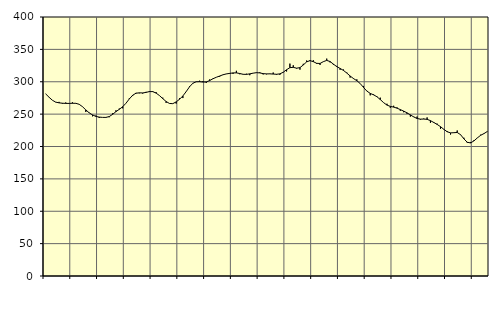
| Category | Piggar | Series 1 |
|---|---|---|
| nan | 281 | 281.24 |
| 87.0 | 276.2 | 276.09 |
| 87.0 | 271.5 | 271.44 |
| 87.0 | 268.3 | 268.53 |
| nan | 268.9 | 267.4 |
| 88.0 | 266.1 | 266.85 |
| 88.0 | 268 | 266.55 |
| 88.0 | 266.9 | 266.56 |
| nan | 268.2 | 266.75 |
| 89.0 | 267 | 266.68 |
| 89.0 | 265.2 | 265.19 |
| 89.0 | 261.7 | 261.53 |
| nan | 253.4 | 256.52 |
| 90.0 | 252.4 | 252.01 |
| 90.0 | 246.6 | 248.76 |
| 90.0 | 247.8 | 246.52 |
| nan | 244 | 245.4 |
| 91.0 | 245 | 244.96 |
| 91.0 | 245.4 | 244.95 |
| 91.0 | 245.2 | 246.22 |
| nan | 251.3 | 249.6 |
| 92.0 | 255.8 | 253.83 |
| 92.0 | 258.6 | 257.41 |
| 92.0 | 259 | 261.33 |
| nan | 266.8 | 266.8 |
| 93.0 | 274.4 | 273.44 |
| 93.0 | 277.9 | 279.18 |
| 93.0 | 282.8 | 282.31 |
| nan | 282.2 | 282.87 |
| 94.0 | 281.8 | 282.74 |
| 94.0 | 284.4 | 283.55 |
| 94.0 | 285.7 | 284.8 |
| nan | 285.6 | 284.74 |
| 95.0 | 284 | 282.5 |
| 95.0 | 278.6 | 278.71 |
| 95.0 | 275.4 | 273.93 |
| nan | 267.4 | 269.5 |
| 96.0 | 266.2 | 266.45 |
| 96.0 | 266.1 | 266.17 |
| 96.0 | 266.3 | 268.9 |
| nan | 274.6 | 272.88 |
| 97.0 | 274.8 | 278.07 |
| 97.0 | 285.1 | 284.81 |
| 97.0 | 293.1 | 292.22 |
| nan | 298.1 | 297.74 |
| 98.0 | 299.6 | 299.95 |
| 98.0 | 301.6 | 300.14 |
| 98.0 | 301.1 | 299.56 |
| nan | 298.2 | 299.75 |
| 99.0 | 303.5 | 301.79 |
| 99.0 | 305 | 304.64 |
| 99.0 | 306.9 | 306.92 |
| nan | 307.9 | 308.84 |
| 0.0 | 310.9 | 310.81 |
| 0.0 | 311.9 | 312.1 |
| 0.0 | 312.2 | 312.91 |
| nan | 312.2 | 313.65 |
| 1.0 | 316.9 | 313.73 |
| 1.0 | 311.6 | 312.74 |
| 1.0 | 311.3 | 311.52 |
| nan | 312.4 | 311.38 |
| 2.0 | 310.1 | 312.19 |
| 2.0 | 313.2 | 313.27 |
| 2.0 | 313.7 | 314.04 |
| nan | 314.6 | 313.65 |
| 3.0 | 311.3 | 312.55 |
| 3.0 | 311.5 | 312.12 |
| 3.0 | 312.5 | 312.21 |
| nan | 314.2 | 311.89 |
| 4.0 | 310.8 | 311.54 |
| 4.0 | 310.7 | 312.17 |
| 4.0 | 315.1 | 314.67 |
| nan | 315.9 | 318.57 |
| 5.0 | 328 | 321.79 |
| 5.0 | 325.4 | 322.26 |
| 5.0 | 320.3 | 320.95 |
| nan | 318.7 | 321.81 |
| 6.0 | 327.7 | 325.91 |
| 6.0 | 332.8 | 330.68 |
| 6.0 | 333.5 | 332.58 |
| nan | 333.2 | 331.03 |
| 7.0 | 327.6 | 328.45 |
| 7.0 | 326 | 328.25 |
| 7.0 | 330.8 | 331.04 |
| nan | 335.7 | 332.96 |
| 8.0 | 329.9 | 331.24 |
| 8.0 | 326.1 | 327.22 |
| 8.0 | 324.5 | 323.4 |
| nan | 318.5 | 320.57 |
| 9.0 | 318.9 | 317.49 |
| 9.0 | 314.2 | 313.43 |
| 9.0 | 306.4 | 308.9 |
| nan | 304.3 | 304.91 |
| 10.0 | 303.7 | 301.57 |
| 10.0 | 297.1 | 297.27 |
| 10.0 | 293.5 | 291.22 |
| nan | 285.9 | 285.56 |
| 11.0 | 279 | 282 |
| 11.0 | 280.6 | 279.8 |
| 11.0 | 277.5 | 276.9 |
| nan | 275.4 | 272.55 |
| 12.0 | 267.6 | 267.76 |
| 12.0 | 266 | 263.97 |
| 12.0 | 259.8 | 261.96 |
| nan | 262.9 | 260.85 |
| 13.0 | 260.4 | 259.22 |
| 13.0 | 255.1 | 256.99 |
| 13.0 | 252.9 | 254.64 |
| nan | 250.5 | 251.96 |
| 14.0 | 246.2 | 248.82 |
| 14.0 | 246.1 | 245.72 |
| 14.0 | 246.2 | 243.25 |
| nan | 241.5 | 242.26 |
| 15.0 | 243.1 | 242.38 |
| 15.0 | 244.9 | 241.95 |
| 15.0 | 236.6 | 239.94 |
| nan | 236.4 | 237.1 |
| 16.0 | 235.3 | 234.11 |
| 16.0 | 227.3 | 230.66 |
| 16.0 | 226.2 | 226.55 |
| nan | 223.9 | 222.78 |
| 17.0 | 218.5 | 221.03 |
| 17.0 | 221.6 | 221.32 |
| 17.0 | 224.7 | 221.66 |
| nan | 217.9 | 218.27 |
| 18.0 | 213.5 | 211.81 |
| 18.0 | 205.5 | 206.53 |
| 18.0 | 207 | 205.53 |
| nan | 209.7 | 208.62 |
| 19.0 | 213.4 | 213.22 |
| 19.0 | 218.2 | 217.28 |
| 19.0 | 219.6 | 219.95 |
| nan | 222.8 | 223.19 |